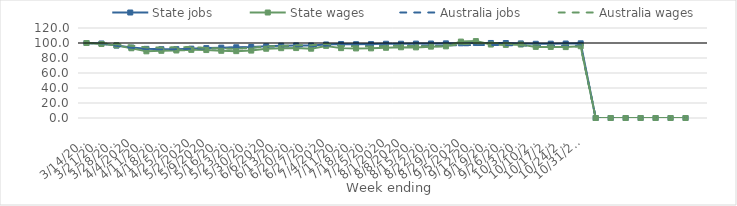
| Category | State jobs | State wages | Australia jobs | Australia wages |
|---|---|---|---|---|
| 14/03/2020 | 100 | 100 | 100 | 100 |
| 21/03/2020 | 99.337 | 98.639 | 99.261 | 99.662 |
| 28/03/2020 | 96.549 | 96.829 | 96.28 | 98.386 |
| 04/04/2020 | 93.864 | 92.968 | 93.636 | 96.64 |
| 11/04/2020 | 92.185 | 88.899 | 91.95 | 94.142 |
| 18/04/2020 | 91.784 | 89.588 | 91.517 | 94.044 |
| 25/04/2020 | 91.802 | 90.011 | 91.861 | 94.24 |
| 02/05/2020 | 92.451 | 90.847 | 92.261 | 94.675 |
| 09/05/2020 | 93.179 | 90.584 | 92.816 | 93.417 |
| 16/05/2020 | 93.807 | 89.611 | 93.349 | 92.645 |
| 23/05/2020 | 94.291 | 89.152 | 93.653 | 92.27 |
| 30/05/2020 | 94.647 | 89.89 | 94.153 | 93.543 |
| 06/06/2020 | 95.65 | 92.348 | 95.073 | 95.449 |
| 13/06/2020 | 96.454 | 93.096 | 95.572 | 96.097 |
| 20/06/2020 | 96.8 | 93.239 | 95.727 | 96.992 |
| 27/06/2020 | 96.691 | 92.403 | 95.674 | 97.05 |
| 04/07/2020 | 98.056 | 96.129 | 96.519 | 98.837 |
| 11/07/2020 | 98.678 | 93.165 | 96.892 | 95.976 |
| 18/07/2020 | 98.38 | 92.76 | 96.803 | 95.549 |
| 25/07/2020 | 98.57 | 92.852 | 96.894 | 95.223 |
| 01/08/2020 | 99.001 | 93.623 | 97.004 | 95.974 |
| 08/08/2020 | 99.001 | 94.296 | 96.893 | 96.39 |
| 15/08/2020 | 99.225 | 94.164 | 96.793 | 95.878 |
| 22/08/2020 | 99.327 | 95.151 | 96.797 | 95.7 |
| 29/08/2020 | 99.538 | 95.532 | 96.807 | 95.852 |
| 05/09/2020 | 99.565 | 101.875 | 96.983 | 98.536 |
| 12/09/2020 | 99.973 | 102.552 | 97.328 | 99.459 |
| 19/09/2020 | 100.037 | 97.95 | 97.472 | 100.228 |
| 26/09/2020 | 99.995 | 97.484 | 97.305 | 99.582 |
| 03/10/2020 | 99.454 | 97.956 | 96.626 | 97.348 |
| 10/10/2020 | 98.959 | 94.833 | 96.269 | 95.474 |
| 17/10/2020 | 99.122 | 94.75 | 96.502 | 95.648 |
| 24/10/2020 | 99.333 | 94.538 | 96.383 | 94.829 |
| 31/10/2020 | 99.567 | 95.687 | 96.953 | 95.711 |